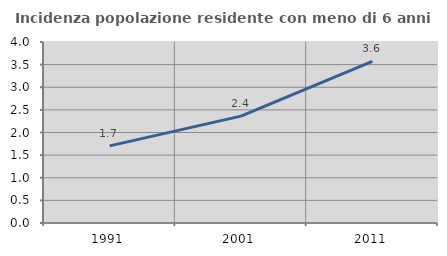
| Category | Incidenza popolazione residente con meno di 6 anni |
|---|---|
| 1991.0 | 1.705 |
| 2001.0 | 2.362 |
| 2011.0 | 3.571 |